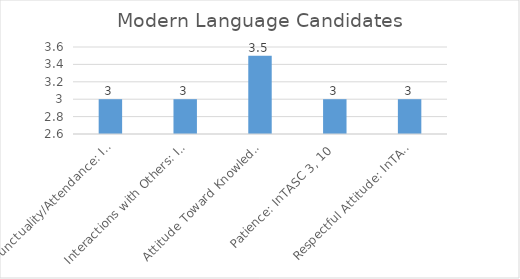
| Category | Series 0 |
|---|---|
| Punctuality/Attendance: InTASC 1, 9 | 3 |
| Interactions with Others: InTASC 3, 7, 10 | 3 |
| Attitude Toward Knowledge and Learning: InTASC 1, 4, 5, 9, 10 | 3.5 |
| Patience: InTASC 3, 10 | 3 |
| Respectful Attitude: InTASC 3, 7, 10 | 3 |